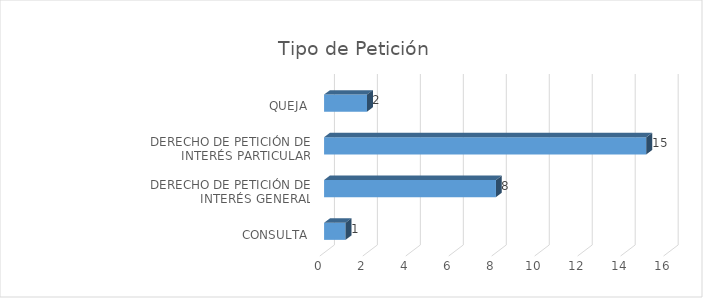
| Category | Total |
|---|---|
| CONSULTA | 1 |
| DERECHO DE PETICIÓN DE INTERÉS GENERAL | 8 |
| DERECHO DE PETICIÓN DE INTERÉS PARTICULAR | 15 |
| QUEJA | 2 |